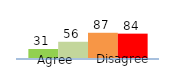
| Category | Series 0 | Series 1 | Series 2 | Series 3 |
|---|---|---|---|---|
| 0 | 31 | 56 | 87 | 84 |